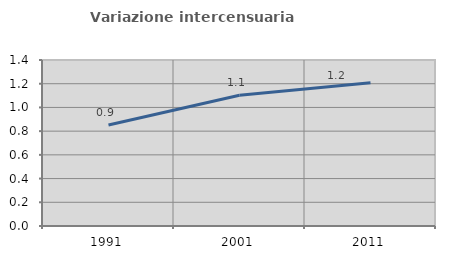
| Category | Variazione intercensuaria annua |
|---|---|
| 1991.0 | 0.852 |
| 2001.0 | 1.102 |
| 2011.0 | 1.208 |